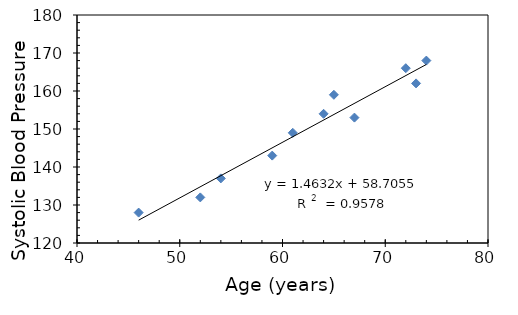
| Category | Series 0 |
|---|---|
| 52.0 | 132 |
| 59.0 | 143 |
| 67.0 | 153 |
| 73.0 | 162 |
| 64.0 | 154 |
| 74.0 | 168 |
| 54.0 | 137 |
| 61.0 | 149 |
| 65.0 | 159 |
| 46.0 | 128 |
| 72.0 | 166 |